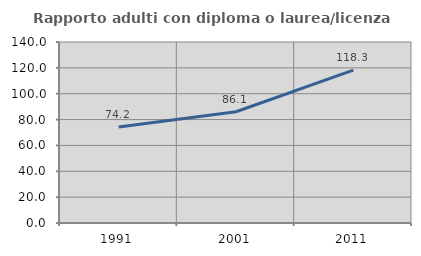
| Category | Rapporto adulti con diploma o laurea/licenza media  |
|---|---|
| 1991.0 | 74.187 |
| 2001.0 | 86.073 |
| 2011.0 | 118.254 |